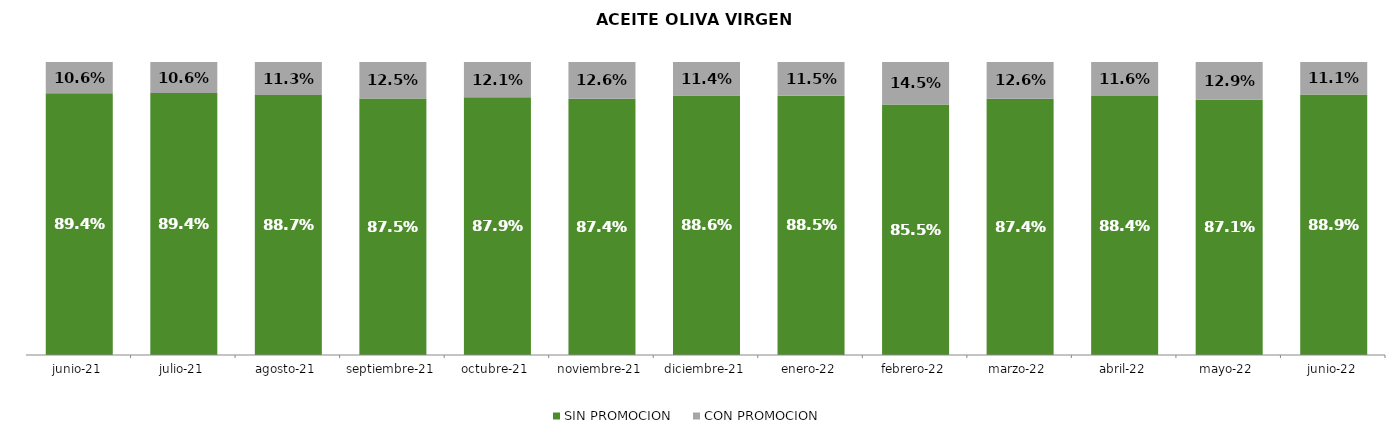
| Category | SIN PROMOCION   | CON PROMOCION   |
|---|---|---|
| 2021-06-01 | 0.894 | 0.106 |
| 2021-07-01 | 0.894 | 0.106 |
| 2021-08-01 | 0.887 | 0.113 |
| 2021-09-01 | 0.875 | 0.125 |
| 2021-10-01 | 0.879 | 0.121 |
| 2021-11-01 | 0.874 | 0.126 |
| 2021-12-01 | 0.886 | 0.114 |
| 2022-01-01 | 0.885 | 0.115 |
| 2022-02-01 | 0.855 | 0.145 |
| 2022-03-01 | 0.874 | 0.126 |
| 2022-04-01 | 0.884 | 0.116 |
| 2022-05-01 | 0.871 | 0.129 |
| 2022-06-01 | 0.889 | 0.111 |